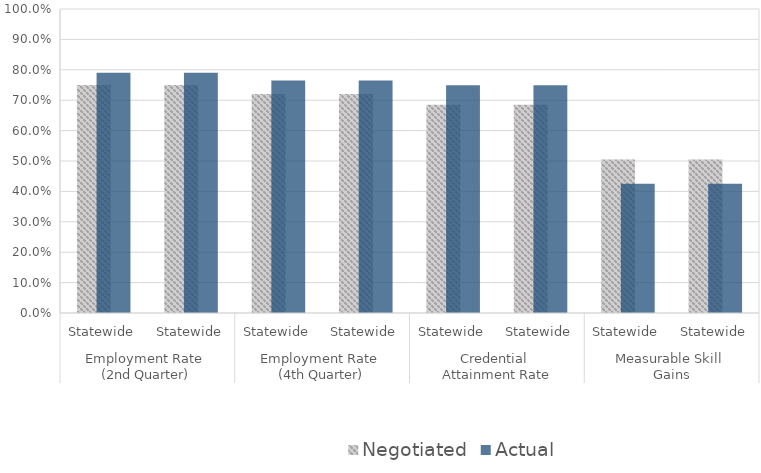
| Category | Negotiated | Actual |
|---|---|---|
| 0 | 0.75 | 0.79 |
| 1 | 0.75 | 0.79 |
| 2 | 0.72 | 0.765 |
| 3 | 0.72 | 0.765 |
| 4 | 0.685 | 0.749 |
| 5 | 0.685 | 0.749 |
| 6 | 0.505 | 0.425 |
| 7 | 0.505 | 0.425 |